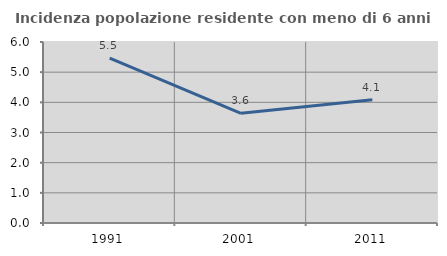
| Category | Incidenza popolazione residente con meno di 6 anni |
|---|---|
| 1991.0 | 5.463 |
| 2001.0 | 3.635 |
| 2011.0 | 4.086 |